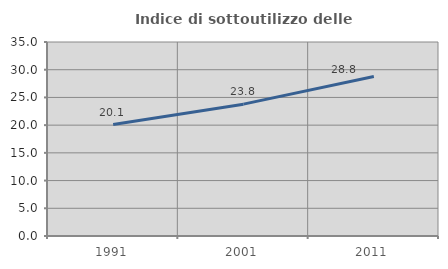
| Category | Indice di sottoutilizzo delle abitazioni  |
|---|---|
| 1991.0 | 20.101 |
| 2001.0 | 23.788 |
| 2011.0 | 28.783 |